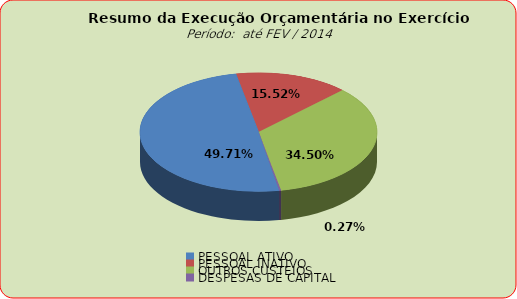
| Category | Series 0 |
|---|---|
| PESSOAL ATIVO | 21265057.01 |
| PESSOAL INATIVO | 6640534.39 |
| OUTROS CUSTEIOS | 14759227.32 |
| DESPESAS DE CAPITAL | 114867.92 |